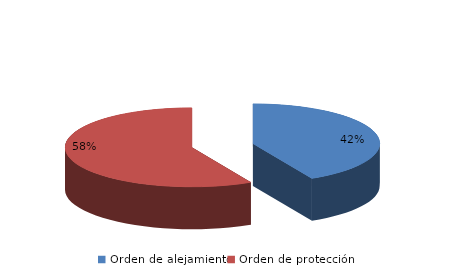
| Category | Series 0 |
|---|---|
| Orden de alejamiento | 74 |
| Orden de protección | 101 |